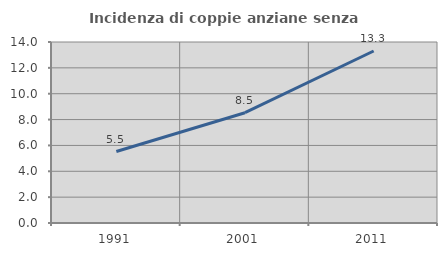
| Category | Incidenza di coppie anziane senza figli  |
|---|---|
| 1991.0 | 5.53 |
| 2001.0 | 8.531 |
| 2011.0 | 13.303 |